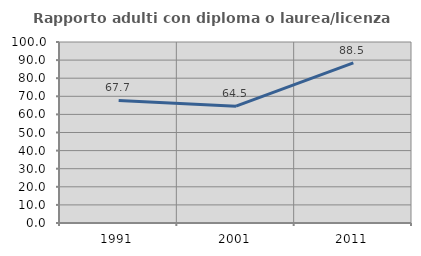
| Category | Rapporto adulti con diploma o laurea/licenza media  |
|---|---|
| 1991.0 | 67.695 |
| 2001.0 | 64.526 |
| 2011.0 | 88.48 |